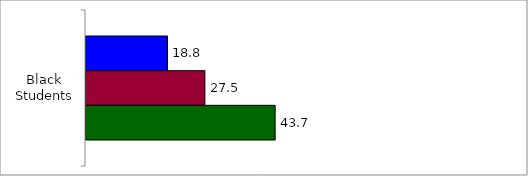
| Category | 50 States and D.C. | SREB States | State |
|---|---|---|---|
| 0 | 18.816 | 27.455 | 43.684 |